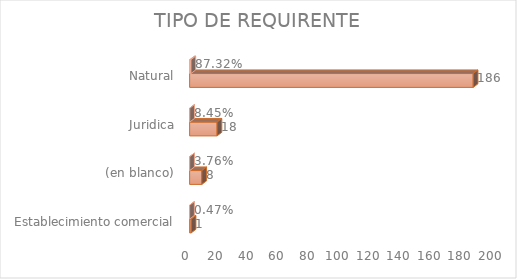
| Category | Cuenta de Número petición | Cuenta de Número petición2 |
|---|---|---|
| Establecimiento comercial | 1 | 0.005 |
| (en blanco) | 8 | 0.038 |
| Juridica | 18 | 0.085 |
| Natural | 186 | 0.873 |